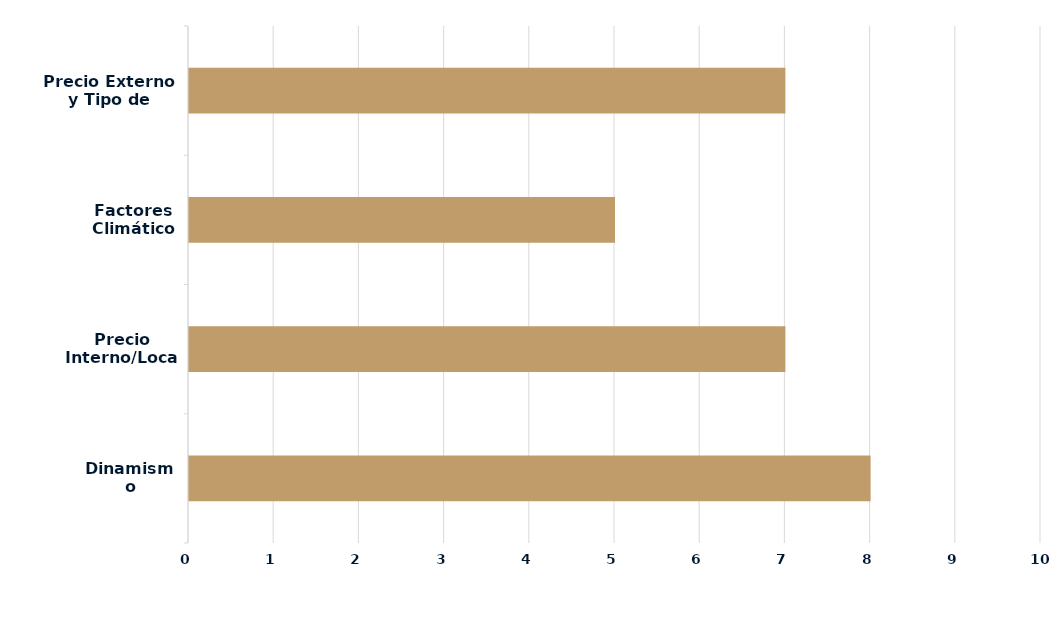
| Category | Series 0 |
|---|---|
| Dinamismo Demanda | 8 |
| Precio Interno/Local | 7 |
| Factores Climáticos | 5 |
| Precio Externo y Tipo de Cambio | 7 |